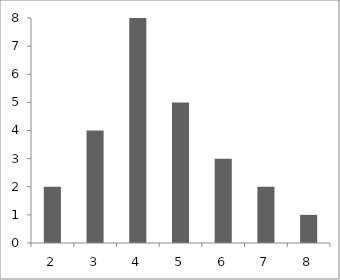
| Category | Series 0 |
|---|---|
| 2.0 | 2 |
| 3.0 | 4 |
| 4.0 | 8 |
| 5.0 | 5 |
| 6.0 | 3 |
| 7.0 | 2 |
| 8.0 | 1 |